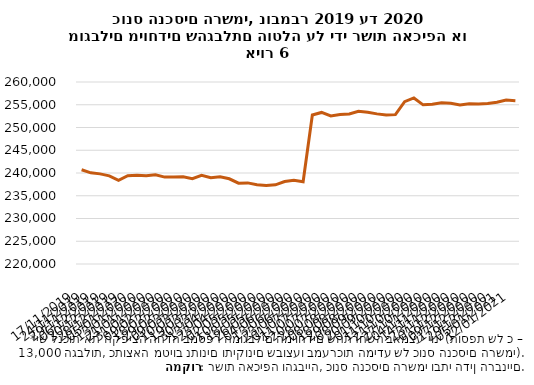
| Category | מוגבל מיוחד |
|---|---|
| 17/11/2019 | 240708 |
| 24/11/2019 | 240043 |
| 29/11/2019 | 239808 |
| 06/12/2019 | 239378 |
| 20/12/2019 | 238393 |
| 28/12/2019 | 239421 |
| 05/01/2020 | 239524 |
| 13/01/2020 | 239420 |
| 21/01/2020 | 239632 |
| 31/01/2020 | 239099 |
| 09/02/2020 | 239120 |
| 18/02/2020 | 239150 |
| 29/02/2020 | 238760 |
| 09/03/2020 | 239502 |
| 10/03/2020 | 238982 |
| 19/03/2020 | 239150 |
| 30/03/2020 | 238731 |
| 13/04/2020 | 237771 |
| 23/04/2020 | 237824 |
| 02/05/2020 | 237432 |
| 10/05/2020 | 237280 |
| 18/05/2020 | 237404 |
| 26/05/2020 | 238115 |
| 04/06/2020 | 238388 |
| 13/06/2020 | 238062 |
| 23/06/2020 | 252763 |
| 01/07/2020 | 253312 |
| 11/07/2020 | 252553 |
| 20/07/2020 | 252857 |
| 28/07/2020 | 252988 |
| 08/08/2020 | 253543 |
| 18/08/2020 | 253359 |
| 29/08/2020 | 252995 |
| 08/09/2020 | 252723 |
| 20/09/2020 | 252823 |
| 01/10/2020 | 255676 |
| 11/10/2020 | 256500 |
| 21/10/2020 | 254983 |
| 27/10/2020 | 255123 |
| 04/11/2020 | 255437 |
| 14/11/2020 | 255343 |
| 23/11/2020 | 254959 |
| 01/12/2020 | 255230 |
| 09/12/2020 | 255142 |
| 17/12/2020 | 255285 |
| 29/12/2020 | 255560 |
| 05/01/2021 | 256033 |
| 12/01/2021 | 255903 |